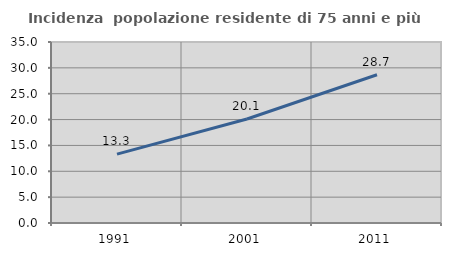
| Category | Incidenza  popolazione residente di 75 anni e più |
|---|---|
| 1991.0 | 13.311 |
| 2001.0 | 20.106 |
| 2011.0 | 28.665 |